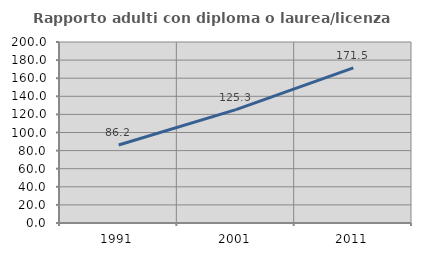
| Category | Rapporto adulti con diploma o laurea/licenza media  |
|---|---|
| 1991.0 | 86.222 |
| 2001.0 | 125.322 |
| 2011.0 | 171.484 |